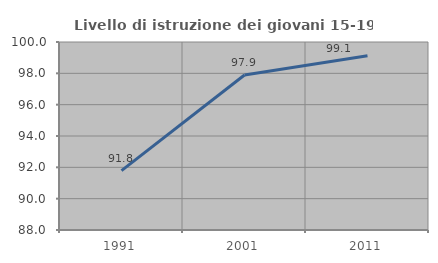
| Category | Livello di istruzione dei giovani 15-19 anni |
|---|---|
| 1991.0 | 91.787 |
| 2001.0 | 97.892 |
| 2011.0 | 99.128 |